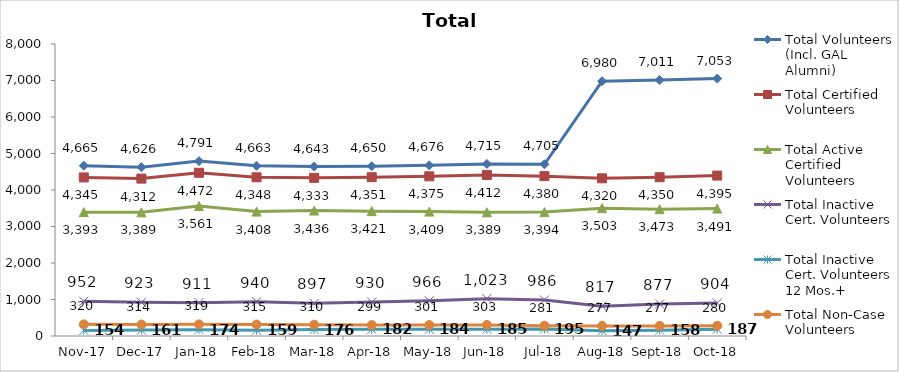
| Category | Total Volunteers (Incl. GAL Alumni) | Total Certified Volunteers | Total Active Certified Volunteers | Total Inactive Cert. Volunteers | Total Inactive Cert. Volunteers 12 Mos.+ | Total Non-Case Volunteers |
|---|---|---|---|---|---|---|
| 2017-11-01 | 4665 | 4345 | 3393 | 952 | 154 | 320 |
| 2017-12-01 | 4626 | 4312 | 3389 | 923 | 161 | 314 |
| 2018-01-01 | 4791 | 4472 | 3561 | 911 | 174 | 319 |
| 2018-02-01 | 4663 | 4348 | 3408 | 940 | 159 | 315 |
| 2018-03-01 | 4643 | 4333 | 3436 | 897 | 176 | 310 |
| 2018-04-01 | 4650 | 4351 | 3421 | 930 | 182 | 299 |
| 2018-05-01 | 4676 | 4375 | 3409 | 966 | 184 | 301 |
| 2018-06-01 | 4715 | 4412 | 3389 | 1023 | 185 | 303 |
| 2018-07-01 | 4705 | 4380 | 3394 | 986 | 195 | 281 |
| 2018-08-01 | 6980 | 4320 | 3503 | 817 | 147 | 277 |
| 2018-09-01 | 7011 | 4350 | 3473 | 877 | 158 | 277 |
| 2018-10-01 | 7053 | 4395 | 3491 | 904 | 187 | 280 |